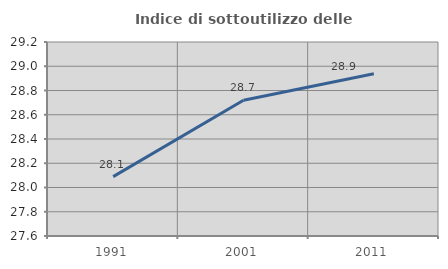
| Category | Indice di sottoutilizzo delle abitazioni  |
|---|---|
| 1991.0 | 28.09 |
| 2001.0 | 28.72 |
| 2011.0 | 28.939 |